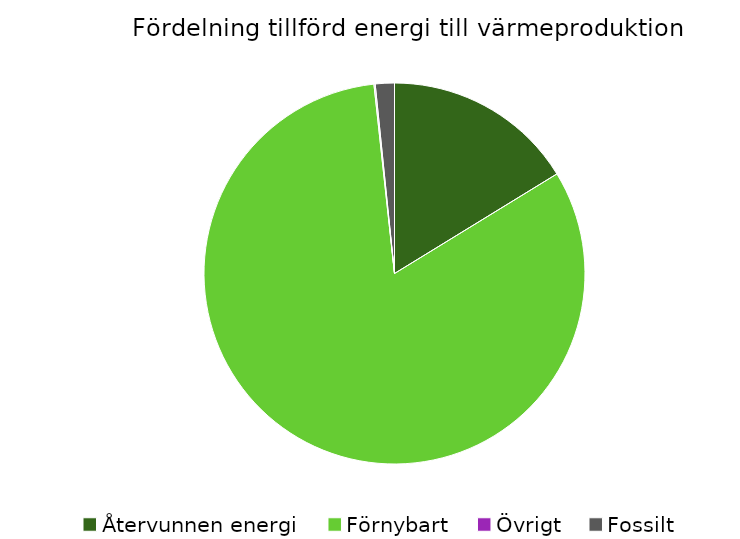
| Category | Fördelning värmeproduktion |
|---|---|
| Återvunnen energi | 0.162 |
| Förnybart | 0.82 |
| Övrigt | 0.001 |
| Fossilt | 0.016 |